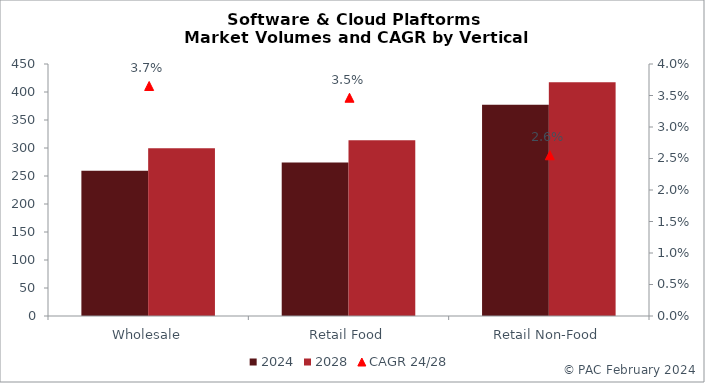
| Category | 2024 | 2028 |
|---|---|---|
| Wholesale | 259.344 | 299.344 |
| Retail Food | 274.06 | 314.06 |
| Retail Non-Food | 377.295 | 417.295 |